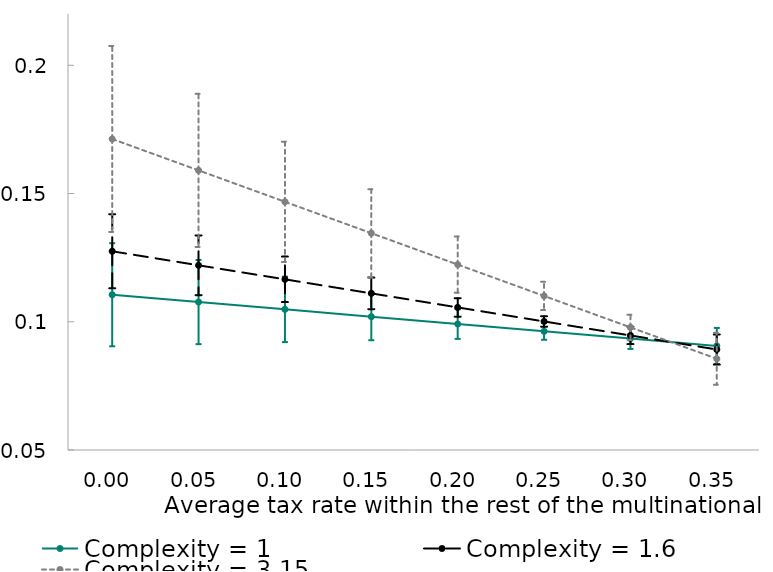
| Category | Complexity = 1 | Complexity = 1.6 | Complexity = 3.15 |
|---|---|---|---|
| 0.0 | 0.111 | 0.127 | 0.171 |
| 0.05 | 0.108 | 0.122 | 0.159 |
| 0.1 | 0.105 | 0.117 | 0.147 |
| 0.15 | 0.102 | 0.111 | 0.135 |
| 0.2 | 0.099 | 0.106 | 0.122 |
| 0.25 | 0.096 | 0.1 | 0.11 |
| 0.3 | 0.093 | 0.095 | 0.098 |
| 0.35 | 0.091 | 0.089 | 0.086 |